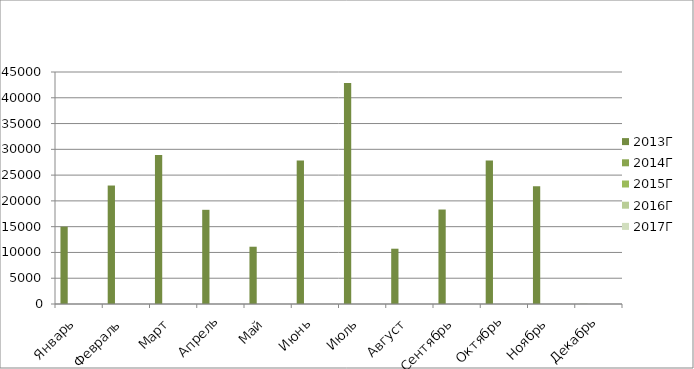
| Category | 2013Г | 2014Г | 2015Г | 2016Г | 2017Г |
|---|---|---|---|---|---|
| Январь  | 15000 | 0 | 0 | 0 | 0 |
| Февраль  | 22980 | 0 | 0 | 0 | 0 |
| Март | 28920 | 0 | 0 | 0 | 0 |
| Апрель | 18270 | 0 | 0 | 0 | 0 |
| Май | 11110 | 0 | 0 | 0 | 0 |
| Июнь | 27845 | 0 | 0 | 0 | 0 |
| Июль | 42845 | 0 | 0 | 0 | 0 |
| Август | 10725 | 0 | 0 | 0 | 0 |
| Сентябрь | 18325 | 0 | 0 | 0 | 0 |
| Октябрь | 27830 | 0 | 0 | 0 | 0 |
| Ноябрь | 22830 | 0 | 0 | 0 | 0 |
| Декабрь | 25 | 0 | 0 | 0 | 0 |